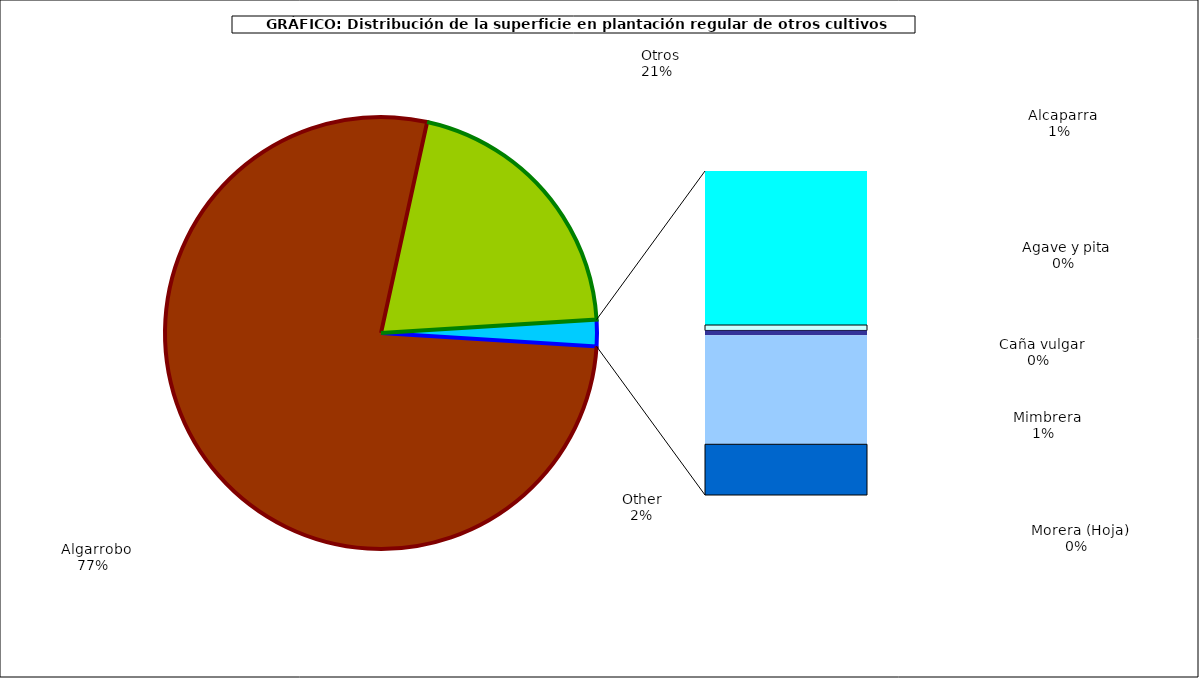
| Category | Series 0 |
|---|---|
|   Algarrobo | 39705 |
|   Otros | 10554 |
|   Alcaparra | 483 |
|   Agave y pita | 17 |
|   Caña vulgar | 15 |
|   Mimbrera | 342 |
|   Morera (Hoja) | 159 |